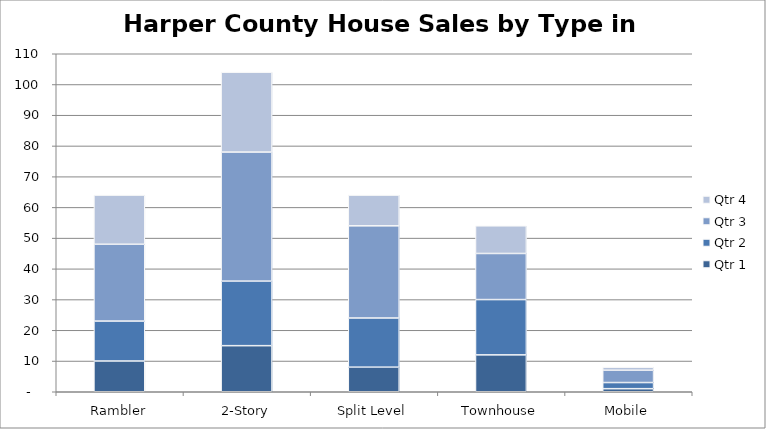
| Category | Qtr 1 | Qtr 2 | Qtr 3 | Qtr 4 |
|---|---|---|---|---|
| Rambler | 10 | 13 | 25 | 16 |
| 2-Story | 15 | 21 | 42 | 26 |
| Split Level | 8 | 16 | 30 | 10 |
| Townhouse | 12 | 18 | 15 | 9 |
| Mobile | 1 | 2 | 4 | 1 |